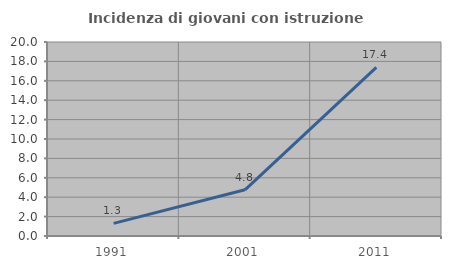
| Category | Incidenza di giovani con istruzione universitaria |
|---|---|
| 1991.0 | 1.299 |
| 2001.0 | 4.762 |
| 2011.0 | 17.391 |